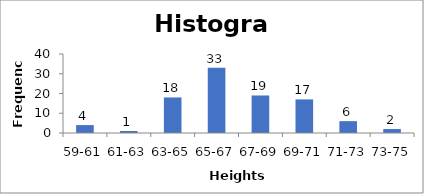
| Category | Series 0 |
|---|---|
| 59-61 | 4 |
| 61-63 | 1 |
| 63-65 | 18 |
| 65-67 | 33 |
| 67-69 | 19 |
| 69-71 | 17 |
| 71-73 | 6 |
| 73-75 | 2 |